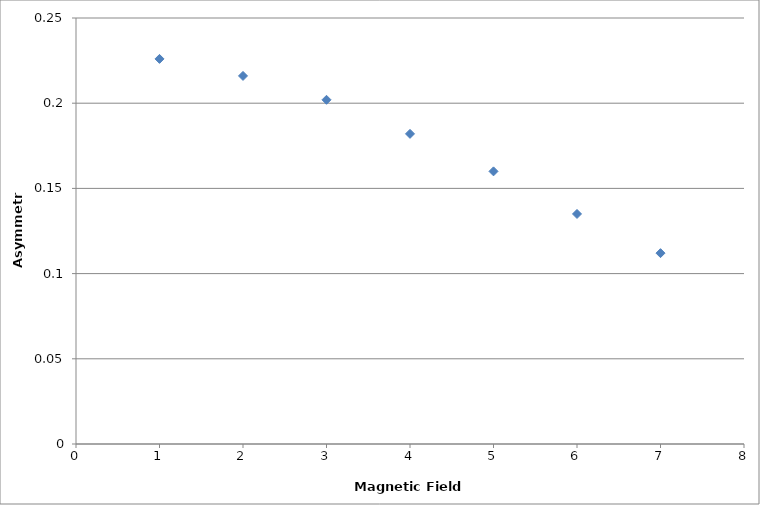
| Category | Series 0 |
|---|---|
| 1.0 | 0.226 |
| 2.0 | 0.216 |
| 3.0 | 0.202 |
| 4.0 | 0.182 |
| 5.0 | 0.16 |
| 6.0 | 0.135 |
| 7.0 | 0.112 |